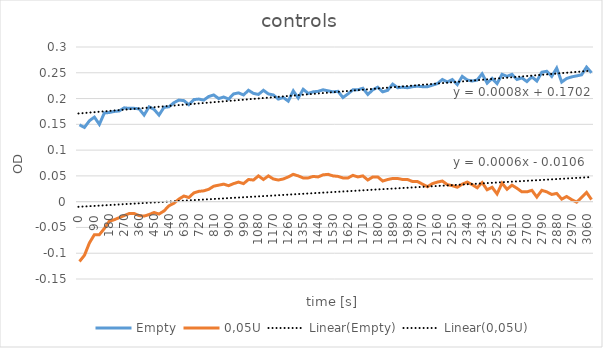
| Category | Empty | 0,05U |
|---|---|---|
| 0.0 | 0.149 | -0.116 |
| 30.0 | 0.144 | -0.104 |
| 60.0 | 0.157 | -0.08 |
| 90.0 | 0.164 | -0.064 |
| 120.0 | 0.15 | -0.064 |
| 150.0 | 0.172 | -0.052 |
| 180.0 | 0.173 | -0.038 |
| 210.0 | 0.175 | -0.035 |
| 240.0 | 0.176 | -0.031 |
| 270.0 | 0.182 | -0.027 |
| 300.0 | 0.181 | -0.023 |
| 330.0 | 0.181 | -0.023 |
| 360.0 | 0.18 | -0.027 |
| 390.0 | 0.168 | -0.028 |
| 420.0 | 0.184 | -0.025 |
| 450.0 | 0.179 | -0.021 |
| 480.0 | 0.168 | -0.024 |
| 510.0 | 0.183 | -0.018 |
| 540.0 | 0.184 | -0.008 |
| 570.0 | 0.192 | -0.003 |
| 600.0 | 0.197 | 0.005 |
| 630.0 | 0.196 | 0.011 |
| 660.0 | 0.188 | 0.008 |
| 690.0 | 0.198 | 0.017 |
| 720.0 | 0.199 | 0.02 |
| 750.0 | 0.197 | 0.021 |
| 780.0 | 0.204 | 0.024 |
| 810.0 | 0.207 | 0.03 |
| 840.0 | 0.2 | 0.032 |
| 870.0 | 0.203 | 0.034 |
| 900.0 | 0.199 | 0.031 |
| 930.0 | 0.209 | 0.035 |
| 960.0 | 0.211 | 0.038 |
| 990.0 | 0.207 | 0.035 |
| 1020.0 | 0.216 | 0.043 |
| 1050.0 | 0.21 | 0.042 |
| 1080.0 | 0.208 | 0.05 |
| 1110.0 | 0.216 | 0.043 |
| 1140.0 | 0.209 | 0.05 |
| 1170.0 | 0.207 | 0.044 |
| 1200.0 | 0.199 | 0.042 |
| 1230.0 | 0.202 | 0.044 |
| 1260.0 | 0.195 | 0.048 |
| 1290.0 | 0.215 | 0.053 |
| 1320.0 | 0.201 | 0.05 |
| 1350.0 | 0.218 | 0.046 |
| 1380.0 | 0.21 | 0.046 |
| 1410.0 | 0.213 | 0.049 |
| 1440.0 | 0.214 | 0.048 |
| 1470.0 | 0.217 | 0.052 |
| 1500.0 | 0.215 | 0.053 |
| 1530.0 | 0.213 | 0.05 |
| 1560.0 | 0.214 | 0.049 |
| 1590.0 | 0.202 | 0.046 |
| 1620.0 | 0.209 | 0.046 |
| 1650.0 | 0.217 | 0.051 |
| 1680.0 | 0.217 | 0.048 |
| 1710.0 | 0.22 | 0.05 |
| 1740.0 | 0.208 | 0.042 |
| 1770.0 | 0.217 | 0.048 |
| 1800.0 | 0.222 | 0.048 |
| 1830.0 | 0.213 | 0.04 |
| 1860.0 | 0.216 | 0.043 |
| 1890.0 | 0.228 | 0.045 |
| 1920.0 | 0.221 | 0.045 |
| 1950.0 | 0.222 | 0.043 |
| 1980.0 | 0.221 | 0.043 |
| 2010.0 | 0.223 | 0.039 |
| 2040.0 | 0.224 | 0.039 |
| 2070.0 | 0.223 | 0.034 |
| 2100.0 | 0.223 | 0.029 |
| 2130.0 | 0.226 | 0.035 |
| 2160.0 | 0.229 | 0.038 |
| 2190.0 | 0.237 | 0.04 |
| 2220.0 | 0.232 | 0.033 |
| 2250.0 | 0.237 | 0.031 |
| 2280.0 | 0.227 | 0.028 |
| 2310.0 | 0.243 | 0.034 |
| 2340.0 | 0.236 | 0.038 |
| 2370.0 | 0.234 | 0.033 |
| 2400.0 | 0.236 | 0.027 |
| 2430.0 | 0.248 | 0.037 |
| 2460.0 | 0.23 | 0.023 |
| 2490.0 | 0.239 | 0.028 |
| 2520.0 | 0.229 | 0.015 |
| 2550.0 | 0.247 | 0.036 |
| 2580.0 | 0.243 | 0.024 |
| 2610.0 | 0.247 | 0.032 |
| 2640.0 | 0.237 | 0.026 |
| 2670.0 | 0.24 | 0.019 |
| 2700.0 | 0.233 | 0.019 |
| 2730.0 | 0.242 | 0.022 |
| 2760.0 | 0.234 | 0.009 |
| 2790.0 | 0.251 | 0.022 |
| 2820.0 | 0.253 | 0.019 |
| 2850.0 | 0.243 | 0.014 |
| 2880.0 | 0.259 | 0.016 |
| 2910.0 | 0.232 | 0.005 |
| 2940.0 | 0.239 | 0.01 |
| 2970.0 | 0.242 | 0.004 |
| 3000.0 | 0.244 | -0.001 |
| 3030.0 | 0.246 | 0.008 |
| 3060.0 | 0.261 | 0.018 |
| 3090.0 | 0.25 | 0.004 |